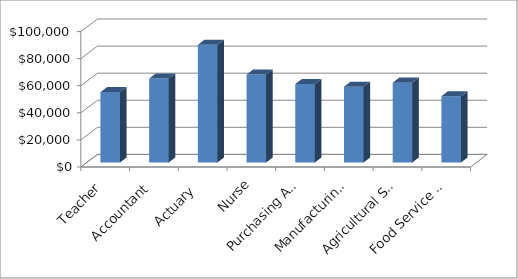
| Category | Series 0 |
|---|---|
| Teacher | 52000 |
| Accountant | 62000 |
| Actuary  | 87000 |
| Nurse | 65000 |
| Purchasing Agent | 58000 |
| Manufacturing Agent | 56000 |
| Agricultural Scientist | 59000 |
| Food Service Manager | 49000 |